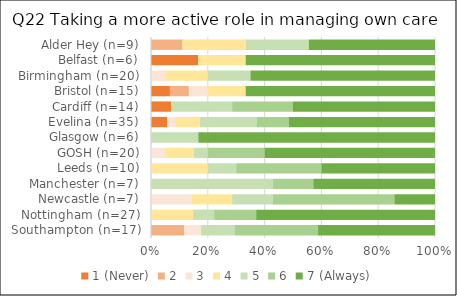
| Category | 1 (Never) | 2 | 3 | 4 | 5 | 6 | 7 (Always) |
|---|---|---|---|---|---|---|---|
| Southampton (n=17) | 0 | 2 | 1 | 0 | 2 | 5 | 7 |
| Nottingham (n=27) | 0 | 0 | 0 | 4 | 2 | 4 | 17 |
| Newcastle (n=7) | 0 | 0 | 1 | 1 | 1 | 3 | 1 |
| Manchester (n=7) | 0 | 0 | 0 | 0 | 3 | 1 | 3 |
| Leeds (n=10) | 0 | 0 | 0 | 2 | 1 | 3 | 4 |
| GOSH (n=20) | 0 | 0 | 1 | 2 | 1 | 4 | 12 |
| Glasgow (n=6) | 0 | 0 | 0 | 0 | 1 | 0 | 5 |
| Evelina (n=35) | 2 | 0 | 1 | 3 | 7 | 4 | 18 |
| Cardiff (n=14) | 1 | 0 | 0 | 0 | 3 | 3 | 7 |
| Bristol (n=15) | 1 | 1 | 1 | 2 | 0 | 0 | 10 |
| Birmingham (n=20) | 0 | 0 | 1 | 3 | 3 | 0 | 13 |
| Belfast (n=6) | 1 | 0 | 0 | 1 | 0 | 0 | 4 |
| Alder Hey (n=9) | 0 | 1 | 0 | 2 | 2 | 0 | 4 |